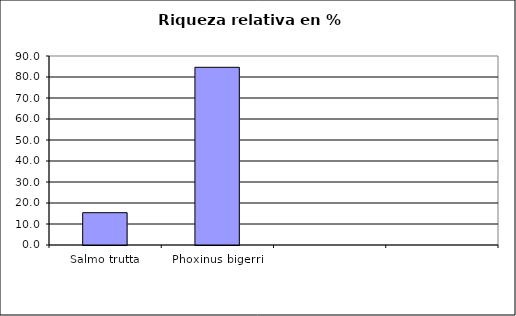
| Category | Series 0 |
|---|---|
| Salmo trutta | 15.385 |
| Phoxinus bigerri | 84.615 |